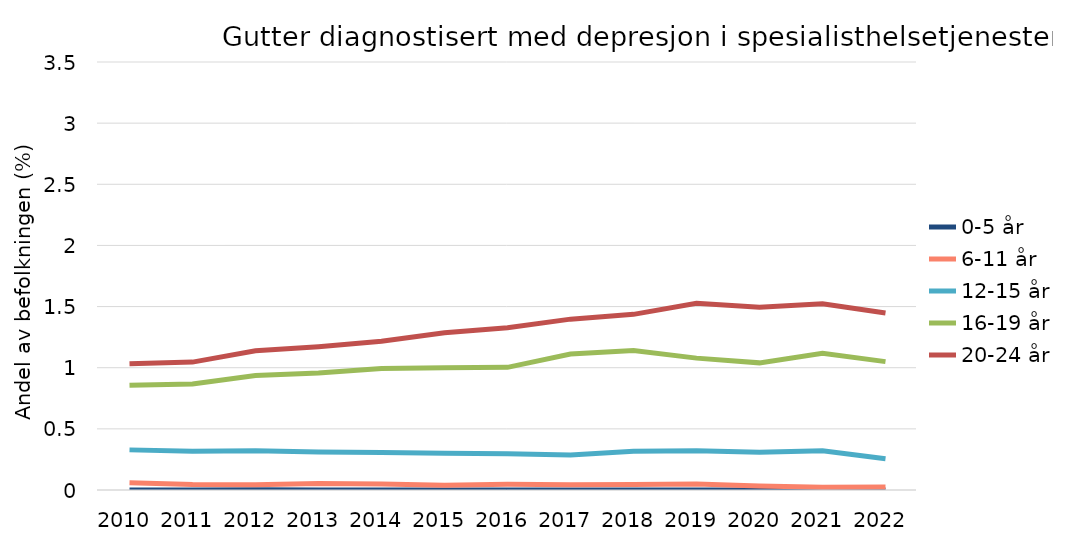
| Category | 0-5 år | 6-11 år | 12-15 år | 16-19 år | 20-24 år |
|---|---|---|---|---|---|
| 2010.0 | 0.001 | 0.059 | 0.328 | 0.857 | 1.033 |
| 2011.0 | 0.001 | 0.044 | 0.316 | 0.868 | 1.046 |
| 2012.0 | 0.003 | 0.043 | 0.321 | 0.936 | 1.138 |
| 2013.0 | 0 | 0.053 | 0.31 | 0.957 | 1.172 |
| 2014.0 | 0.001 | 0.05 | 0.307 | 0.993 | 1.216 |
| 2015.0 | 0.001 | 0.04 | 0.301 | 1.001 | 1.287 |
| 2016.0 | 0 | 0.047 | 0.296 | 1.003 | 1.326 |
| 2017.0 | 0 | 0.044 | 0.285 | 1.111 | 1.397 |
| 2018.0 | 0.001 | 0.044 | 0.317 | 1.14 | 1.436 |
| 2019.0 | 0.001 | 0.05 | 0.322 | 1.078 | 1.528 |
| 2020.0 | 0 | 0.032 | 0.309 | 1.04 | 1.494 |
| 2021.0 | 0.001 | 0.023 | 0.32 | 1.118 | 1.522 |
| 2022.0 | 0.001 | 0.024 | 0.256 | 1.05 | 1.448 |